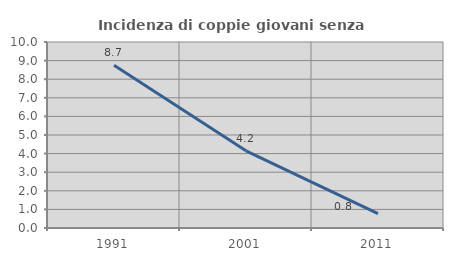
| Category | Incidenza di coppie giovani senza figli |
|---|---|
| 1991.0 | 8.745 |
| 2001.0 | 4.151 |
| 2011.0 | 0.775 |